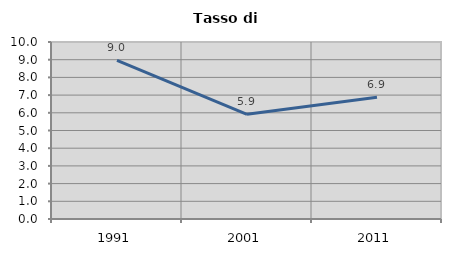
| Category | Tasso di disoccupazione   |
|---|---|
| 1991.0 | 8.964 |
| 2001.0 | 5.912 |
| 2011.0 | 6.874 |